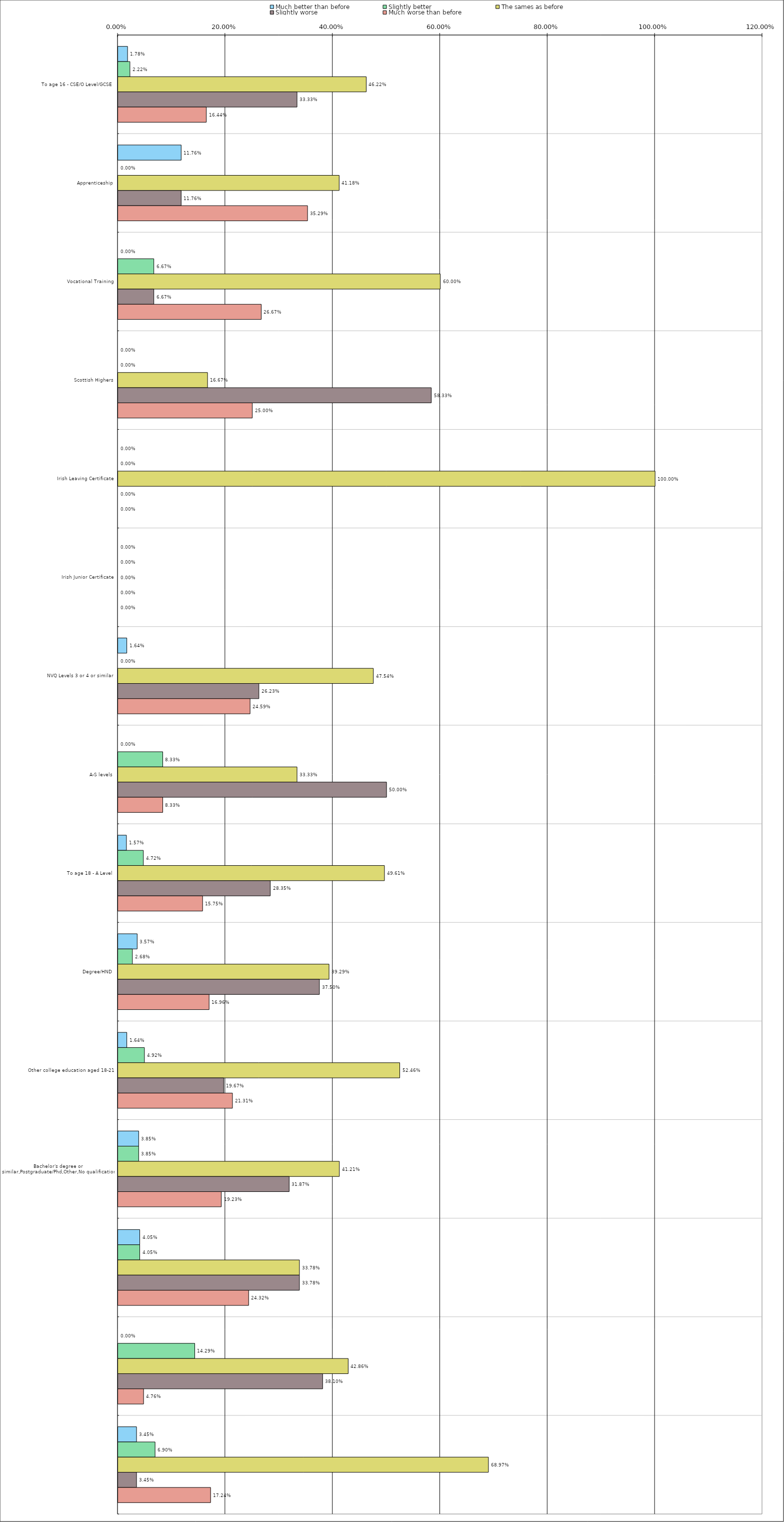
| Category | Much better than before | Slightly better | The sames as before | Slightly worse | Much worse than before |
|---|---|---|---|---|---|
| 0 | 0.018 | 0.022 | 0.462 | 0.333 | 0.164 |
| 1 | 0.118 | 0 | 0.412 | 0.118 | 0.353 |
| 2 | 0 | 0.067 | 0.6 | 0.067 | 0.267 |
| 3 | 0 | 0 | 0.167 | 0.583 | 0.25 |
| 4 | 0 | 0 | 1 | 0 | 0 |
| 5 | 0 | 0 | 0 | 0 | 0 |
| 6 | 0.016 | 0 | 0.475 | 0.262 | 0.246 |
| 7 | 0 | 0.083 | 0.333 | 0.5 | 0.083 |
| 8 | 0.016 | 0.047 | 0.496 | 0.284 | 0.158 |
| 9 | 0.036 | 0.027 | 0.393 | 0.375 | 0.17 |
| 10 | 0.016 | 0.049 | 0.525 | 0.197 | 0.213 |
| 11 | 0.038 | 0.038 | 0.412 | 0.319 | 0.192 |
| 12 | 0.04 | 0.04 | 0.338 | 0.338 | 0.243 |
| 13 | 0 | 0.143 | 0.429 | 0.381 | 0.048 |
| 14 | 0.034 | 0.069 | 0.69 | 0.034 | 0.172 |